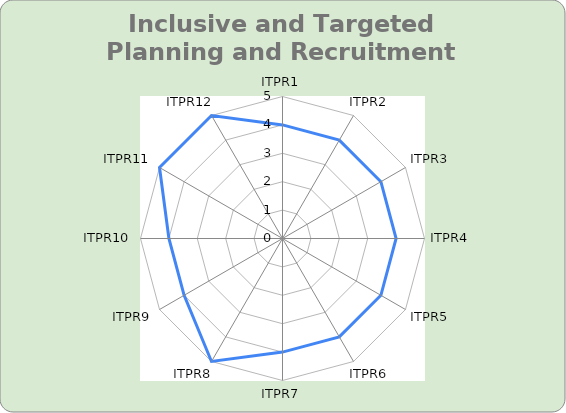
| Category | Series 0 |
|---|---|
| ITPR1 | 4 |
| ITPR2 | 4 |
| ITPR3 | 4 |
| ITPR4 | 4 |
| ITPR5 | 4 |
| ITPR6 | 4 |
| ITPR7 | 4 |
| ITPR8 | 5 |
| ITPR9 | 4 |
| ITPR10 | 4 |
| ITPR11 | 5 |
| ITPR12 | 5 |